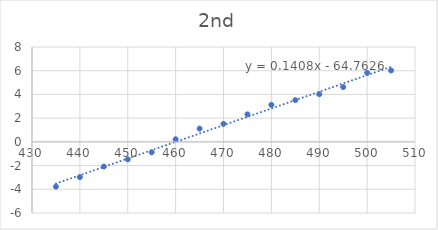
| Category | Series 0 |
|---|---|
| 435.0 | -3.78 |
| 440.0 | -2.98 |
| 445.0 | -2.08 |
| 450.0 | -1.48 |
| 455.0 | -0.88 |
| 460.0 | 0.22 |
| 465.0 | 1.12 |
| 470.0 | 1.52 |
| 475.0 | 2.32 |
| 480.0 | 3.12 |
| 485.0 | 3.52 |
| 490.0 | 4.02 |
| 495.0 | 4.62 |
| 500.0 | 5.82 |
| 505.0 | 6.02 |